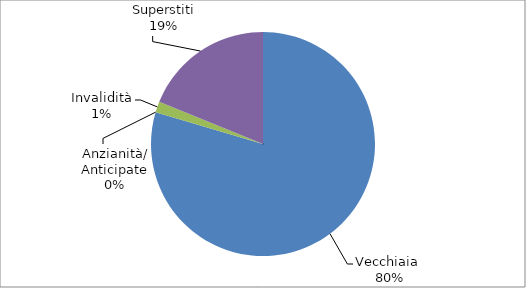
| Category | Series 0 |
|---|---|
| Vecchiaia  | 5376 |
| Anzianità/ Anticipate | 0 |
| Invalidità | 106 |
| Superstiti | 1273 |